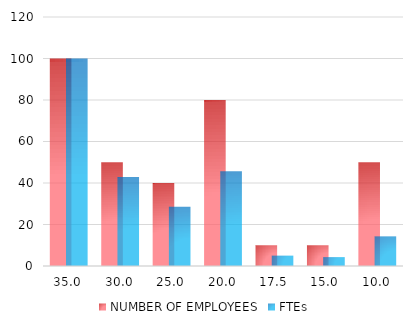
| Category | NUMBER OF EMPLOYEES | FTEs |
|---|---|---|
| 35.0 | 100 | 100 |
| 30.0 | 50 | 42.857 |
| 25.0 | 40 | 28.571 |
| 20.0 | 80 | 45.714 |
| 17.5 | 10 | 5 |
| 15.0 | 10 | 4.286 |
| 10.0 | 50 | 14.286 |